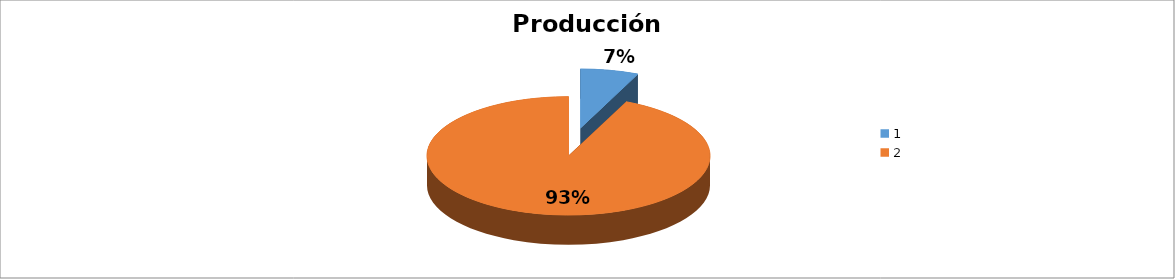
| Category | Series 0 |
|---|---|
| 0 | 0.067 |
| 1 | 0.933 |